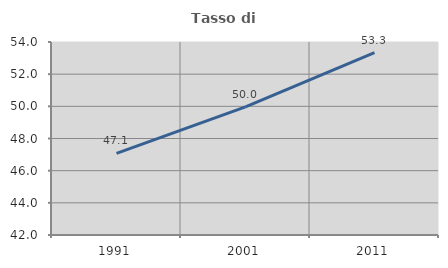
| Category | Tasso di occupazione   |
|---|---|
| 1991.0 | 47.077 |
| 2001.0 | 49.964 |
| 2011.0 | 53.339 |